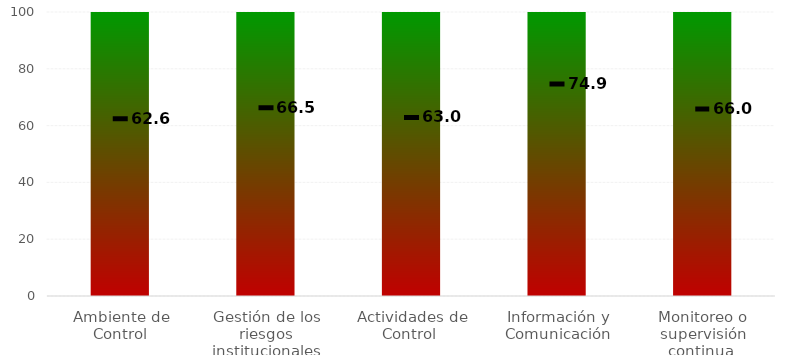
| Category | Rangos |
|---|---|
| Ambiente de Control | 100 |
| Gestión de los riesgos institucionales | 100 |
| Actividades de Control  | 100 |
| Información y Comunicación | 100 |
| Monitoreo o supervisión continua  | 100 |